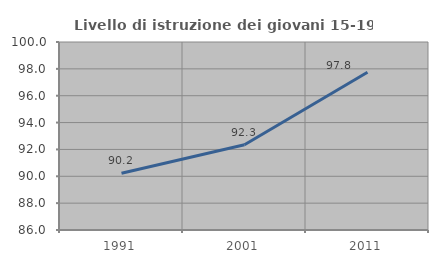
| Category | Livello di istruzione dei giovani 15-19 anni |
|---|---|
| 1991.0 | 90.226 |
| 2001.0 | 92.347 |
| 2011.0 | 97.753 |